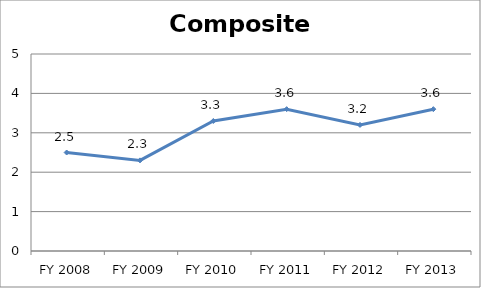
| Category | Composite score |
|---|---|
| FY 2013 | 3.6 |
| FY 2012 | 3.2 |
| FY 2011 | 3.6 |
| FY 2010 | 3.3 |
| FY 2009 | 2.3 |
| FY 2008 | 2.5 |